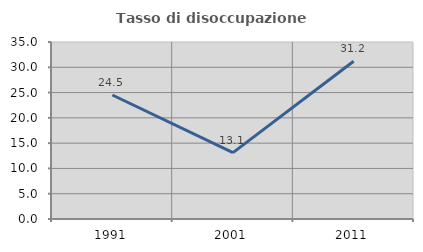
| Category | Tasso di disoccupazione giovanile  |
|---|---|
| 1991.0 | 24.519 |
| 2001.0 | 13.131 |
| 2011.0 | 31.193 |